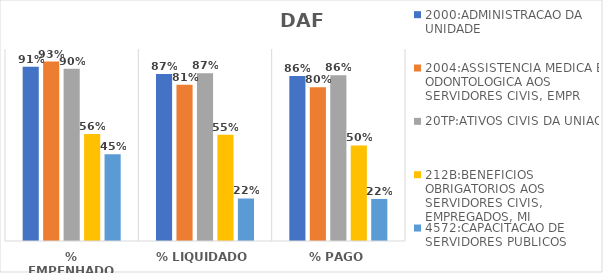
| Category | 2000:ADMINISTRACAO DA UNIDADE | 2004:ASSISTENCIA MEDICA E ODONTOLOGICA AOS SERVIDORES CIVIS, EMPR | 20TP:ATIVOS CIVIS DA UNIAO | 212B:BENEFICIOS OBRIGATORIOS AOS SERVIDORES CIVIS, EMPREGADOS, MI | 4572:CAPACITACAO DE SERVIDORES PUBLICOS FEDERAIS EM PROCESSO DE Q |
|---|---|---|---|---|---|
| % EMPENHADO | 0.908 | 0.934 | 0.898 | 0.558 | 0.452 |
| % LIQUIDADO | 0.87 | 0.814 | 0.873 | 0.554 | 0.221 |
| % PAGO | 0.86 | 0.801 | 0.864 | 0.498 | 0.219 |